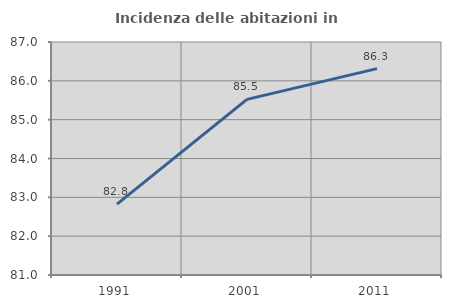
| Category | Incidenza delle abitazioni in proprietà  |
|---|---|
| 1991.0 | 82.826 |
| 2001.0 | 85.523 |
| 2011.0 | 86.313 |